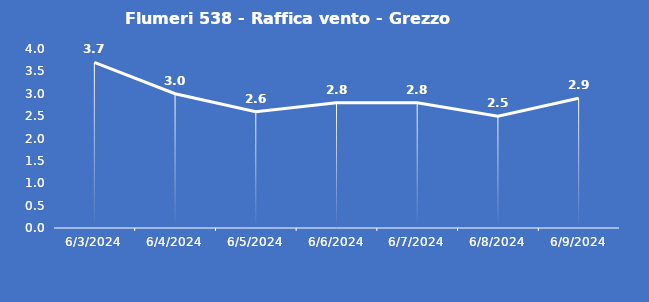
| Category | Flumeri 538 - Raffica vento - Grezzo (m/s) |
|---|---|
| 6/3/24 | 3.7 |
| 6/4/24 | 3 |
| 6/5/24 | 2.6 |
| 6/6/24 | 2.8 |
| 6/7/24 | 2.8 |
| 6/8/24 | 2.5 |
| 6/9/24 | 2.9 |